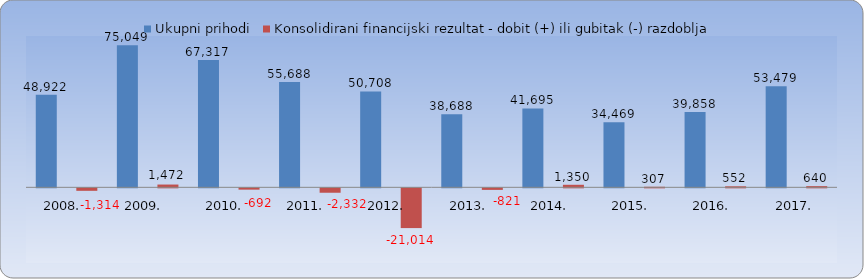
| Category | Ukupni prihodi | Konsolidirani financijski rezultat - dobit (+) ili gubitak (-) razdoblja |
|---|---|---|
| 2008.  | 48921.602 | -1314.349 |
| 2009.  | 75048.781 | 1472.104 |
| 2010.  | 67316.979 | -691.654 |
| 2011.  | 55687.836 | -2331.861 |
| 2012.  | 50707.894 | -21013.769 |
| 2013.  | 38688.379 | -821.172 |
| 2014.  | 41695.27 | 1349.563 |
| 2015.  | 34469.184 | 306.695 |
| 2016.  | 39857.897 | 551.689 |
| 2017. | 53479.04 | 639.995 |